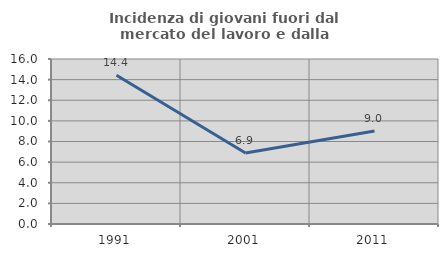
| Category | Incidenza di giovani fuori dal mercato del lavoro e dalla formazione  |
|---|---|
| 1991.0 | 14.419 |
| 2001.0 | 6.878 |
| 2011.0 | 9.028 |